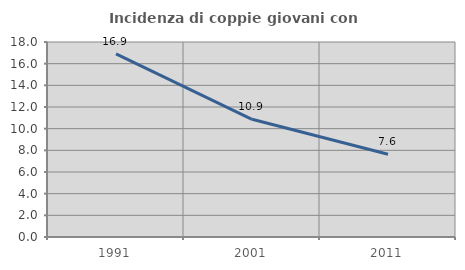
| Category | Incidenza di coppie giovani con figli |
|---|---|
| 1991.0 | 16.901 |
| 2001.0 | 10.862 |
| 2011.0 | 7.633 |